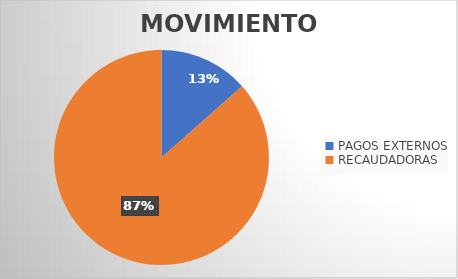
| Category | MOVIMIENTOS |
|---|---|
| PAGOS EXTERNOS | 5520 |
| RECAUDADORAS | 35404 |